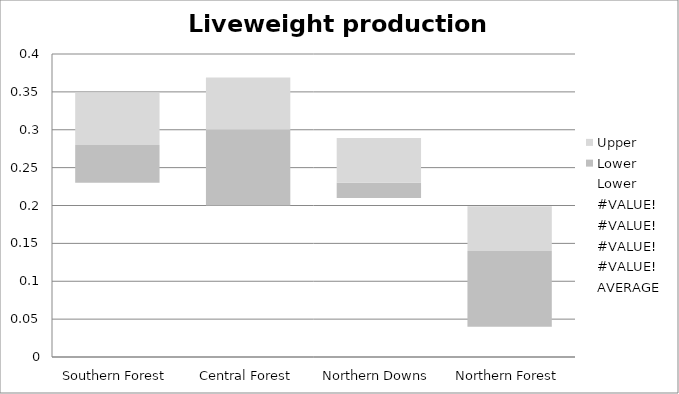
| Category | Lower | Upper |
|---|---|---|
| Southern Forest | 0.05 | 0.069 |
| Central Forest | 0.1 | 0.069 |
| Northern Downs | 0.02 | 0.059 |
| Northern Forest | 0.1 | 0.059 |